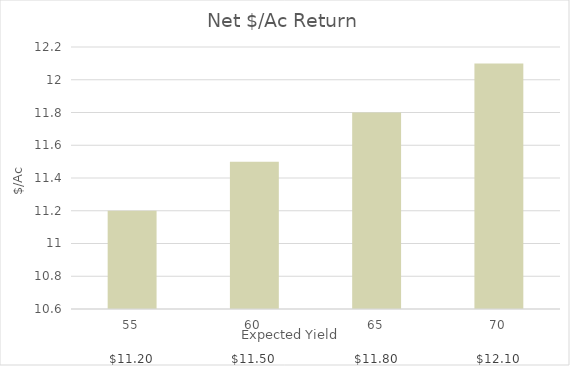
| Category | Net |
|---|---|
| 55 | 11.2 |
| 60 | 11.5 |
| 65 | 11.8 |
| 70 | 12.1 |